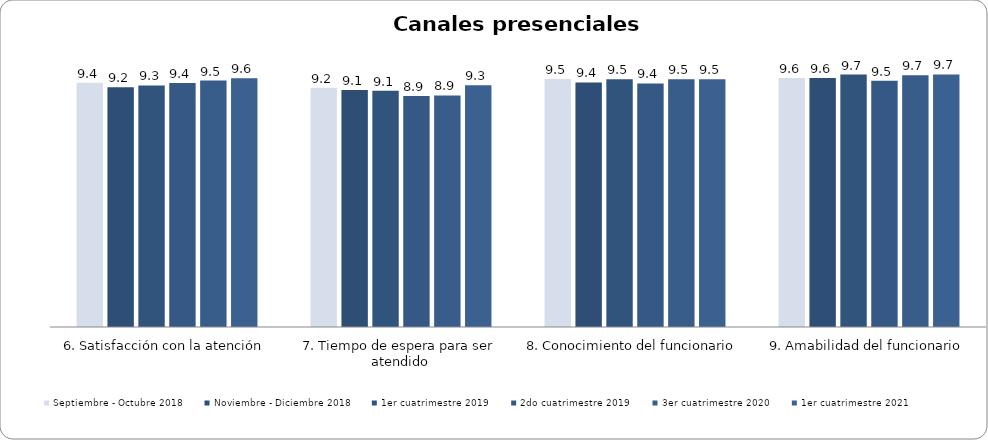
| Category | Septiembre - Octubre 2018 | Noviembre - Diciembre 2018 | 1er cuatrimestre 2019 | 2do cuatrimestre 2019 | 3er cuatrimestre 2020 | 1er cuatrimestre 2021 |
|---|---|---|---|---|---|---|
| 6. Satisfacción con la atención | 9.393 | 9.225 | 9.291 | 9.38 | 9.476 | 9.571 |
| 7. Tiempo de espera para ser atendido | 9.206 | 9.112 | 9.082 | 8.88 | 8.905 | 9.303 |
| 8. Conocimiento del funcionario | 9.542 | 9.404 | 9.527 | 9.37 | 9.532 | 9.529 |
| 9. Amabilidad del funcionario | 9.579 | 9.573 | 9.709 | 9.47 | 9.683 | 9.714 |